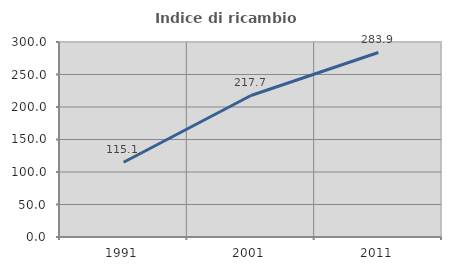
| Category | Indice di ricambio occupazionale  |
|---|---|
| 1991.0 | 115.068 |
| 2001.0 | 217.742 |
| 2011.0 | 283.908 |